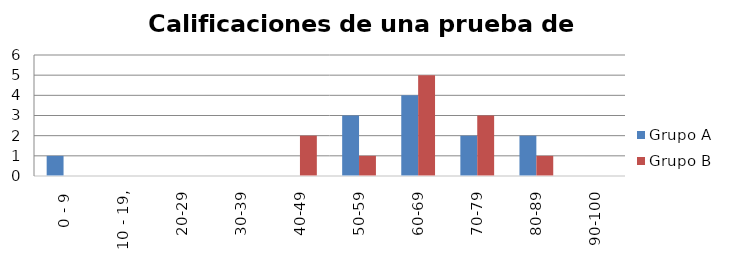
| Category | Grupo A | Grupo B |
|---|---|---|
| 0 - 9 | 1 | 0 |
| 10 - 19, | 0 | 0 |
| 20-29 | 0 | 0 |
| 30-39 | 0 | 0 |
| 40-49 | 0 | 2 |
| 50-59 | 3 | 1 |
| 60-69 | 4 | 5 |
| 70-79 | 2 | 3 |
| 80-89 | 2 | 1 |
| 90-100 | 0 | 0 |